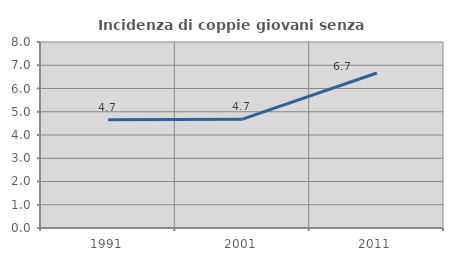
| Category | Incidenza di coppie giovani senza figli |
|---|---|
| 1991.0 | 4.651 |
| 2001.0 | 4.681 |
| 2011.0 | 6.667 |